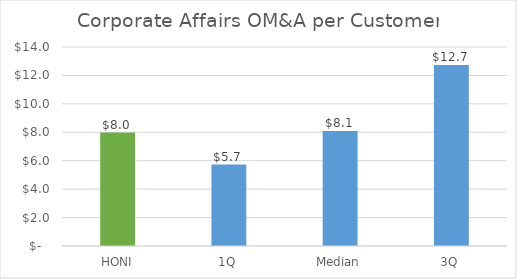
| Category | Corporate Affairs OM&A per Customer |
|---|---|
| HONI | 7.984 |
| 1Q | 5.733 |
| Median | 8.092 |
| 3Q | 12.725 |